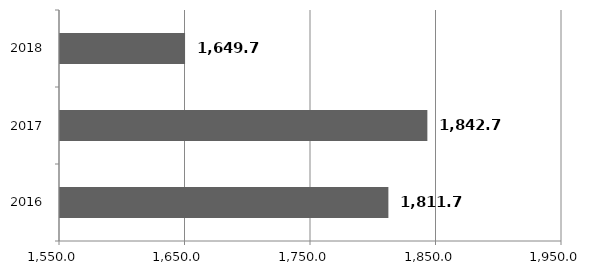
| Category | Series 0 |
|---|---|
| 2016.0 | 1811.66 |
| 2017.0 | 1842.72 |
| 2018.0 | 1649.65 |